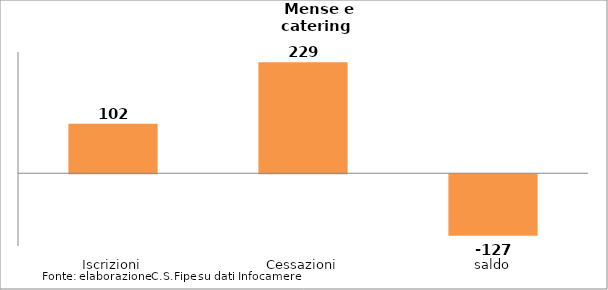
| Category | Series 0 |
|---|---|
| Iscrizioni | 102 |
| Cessazioni | 229 |
| saldo | -127 |